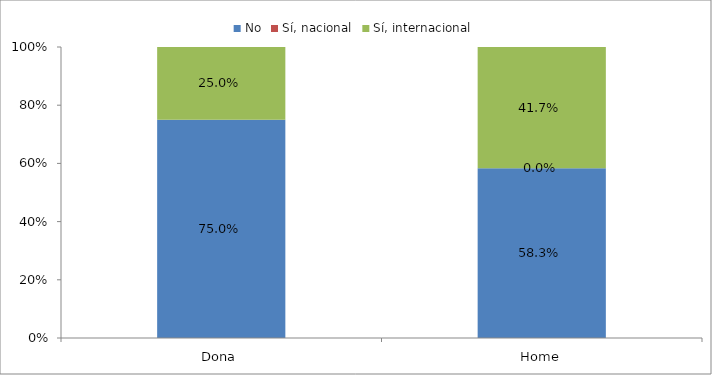
| Category | No | Sí, nacional | Sí, internacional |
|---|---|---|---|
| Dona | 0.75 | 0 | 0.25 |
| Home | 0.583 | 0 | 0.417 |